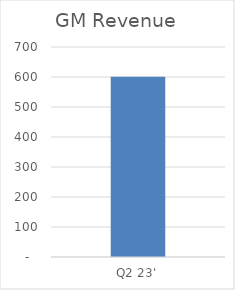
| Category | GM Revenue |
|---|---|
| Q2 23' | 600.604 |